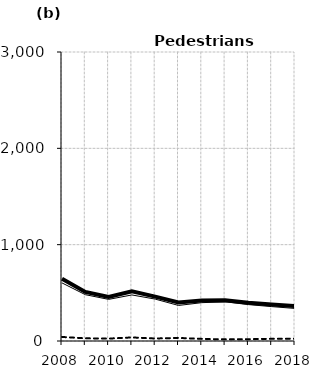
| Category | Built-up | Non built-up | Total |
|---|---|---|---|
| 2008.0 | 603 | 42 | 645 |
| 2009.0 | 481 | 28 | 509 |
| 2010.0 | 432 | 25 | 457 |
| 2011.0 | 478 | 37 | 515 |
| 2012.0 | 435 | 26 | 461 |
| 2013.0 | 369 | 32 | 401 |
| 2014.0 | 398 | 22 | 420 |
| 2015.0 | 407 | 17 | 424 |
| 2016.0 | 378 | 19 | 397 |
| 2017.0 | 357 | 23 | 380 |
| 2018.0 | 338 | 24 | 362 |